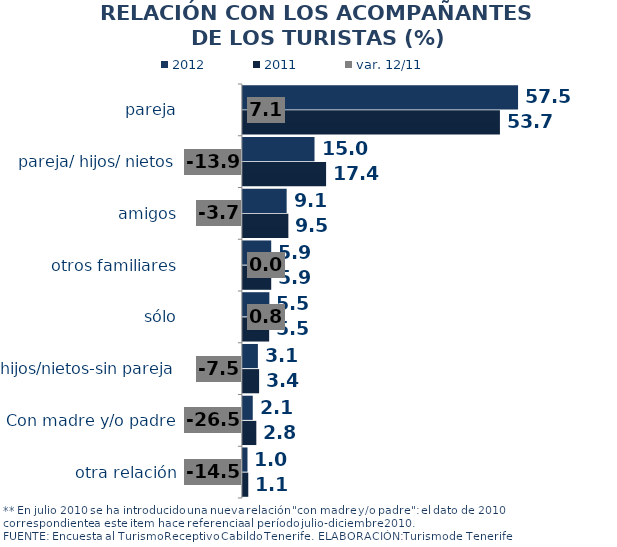
| Category | 2012 | 2011 |
|---|---|---|
| pareja | 57.482 | 53.691 |
| pareja/ hijos/ nietos | 14.964 | 17.382 |
| amigos | 9.145 | 9.5 |
| otros familiares | 5.918 | 5.918 |
| sólo | 5.536 | 5.491 |
| hijos/nietos-sin pareja | 3.136 | 3.391 |
| Con madre y/o padre | 2.064 | 2.809 |
| otra relación | 0.964 | 1.127 |